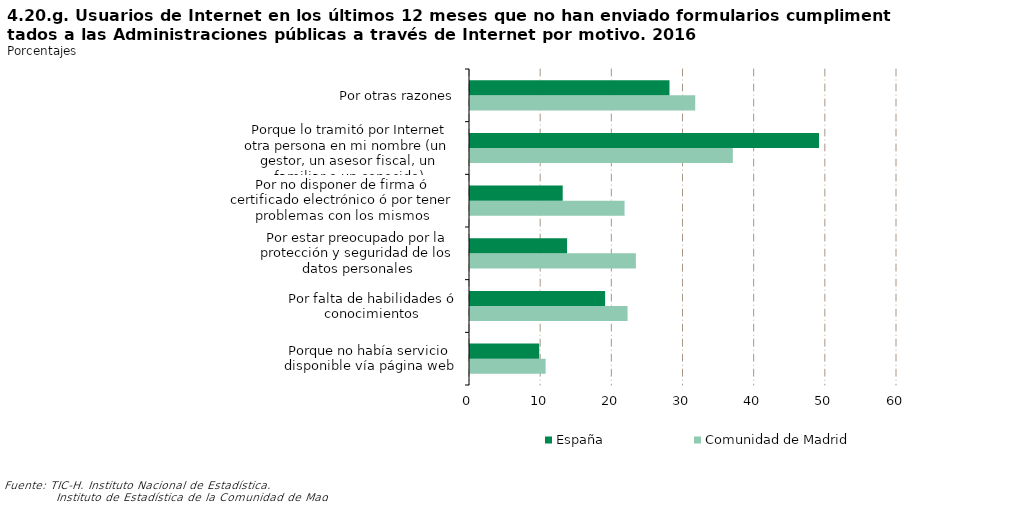
| Category | Comunidad de Madrid | España |
|---|---|---|
| Porque no había servicio disponible vía página web | 10.626 | 9.725 |
| Por falta de habilidades ó conocimientos | 22.14 | 18.984 |
| Por estar preocupado por la protección y seguridad de los datos personales | 23.309 | 13.644 |
| Por no disponer de firma ó certificado electrónico ó por tener problemas con los mismos | 21.717 | 13.026 |
| Porque lo tramitó por Internet otra persona en mi nombre (un  gestor, un asesor fiscal, un familiar o un conocido) | 36.93 | 49.045 |
| Por otras razones | 31.649 | 28.03 |